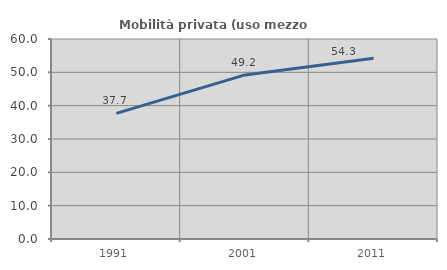
| Category | Mobilità privata (uso mezzo privato) |
|---|---|
| 1991.0 | 37.686 |
| 2001.0 | 49.221 |
| 2011.0 | 54.257 |